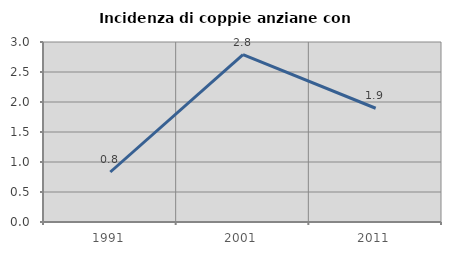
| Category | Incidenza di coppie anziane con figli |
|---|---|
| 1991.0 | 0.833 |
| 2001.0 | 2.791 |
| 2011.0 | 1.896 |